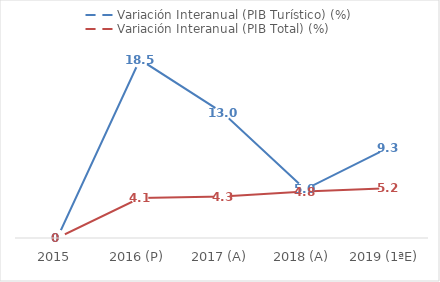
| Category | Variación Interanual (PIB Turístico) (%) | Variación Interanual (PIB Total) (%) |
|---|---|---|
| 2015 | 0 | 0 |
| 2016 (P) | 18.49 | 4.142 |
| 2017 (A) | 12.998 | 4.289 |
| 2018 (A) | 5.046 | 4.812 |
| 2019 (1ªE) | 9.308 | 5.165 |